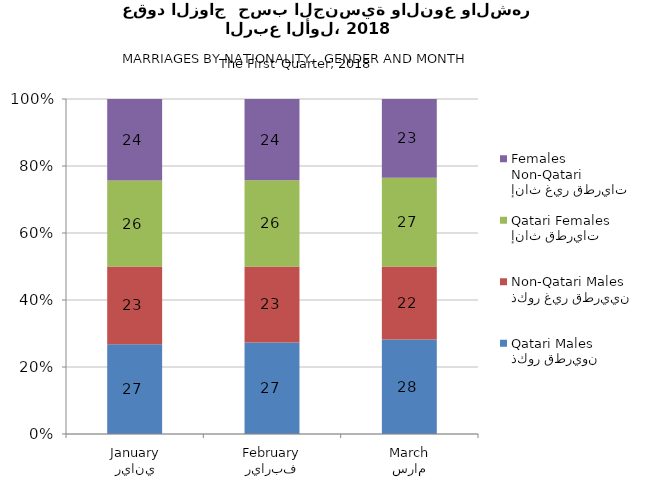
| Category | ذكور قطريون
Qatari Males | ذكور غير قطريين
Non-Qatari Males | إناث قطريات
Qatari Females | إناث غير قطريات
Non-Qatari Females |
|---|---|---|---|---|
| يناير
January | 26.809 | 23.191 | 25.658 | 24.342 |
| فبراير
February | 27.32 | 22.68 | 25.773 | 24.227 |
| مارس
March | 28.242 | 21.758 | 26.513 | 23.487 |